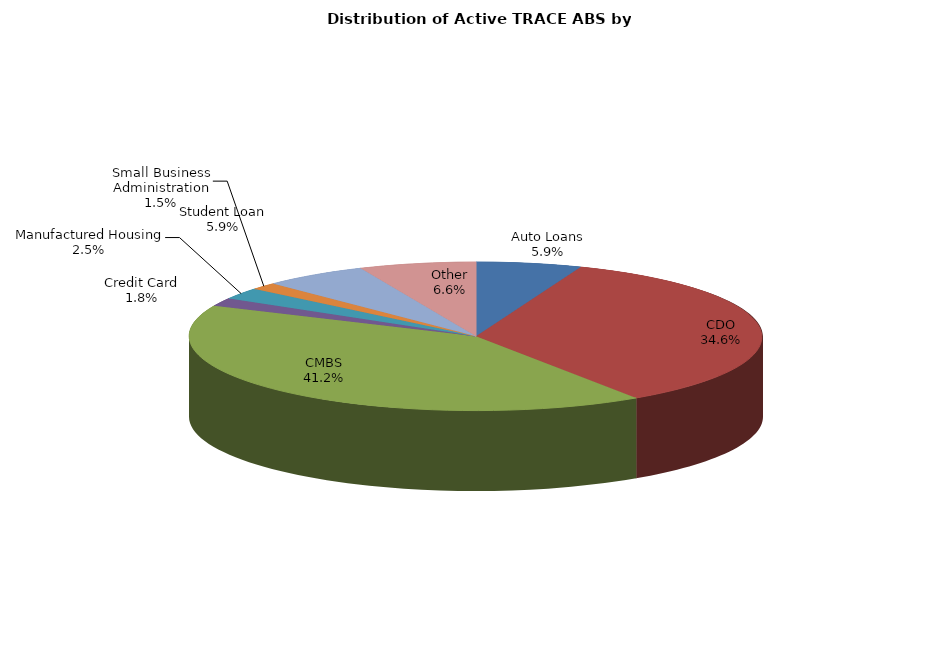
| Category | Series 0 |
|---|---|
| Auto Loans | 1263 |
| CDO | 7356 |
| CMBS | 8743 |
| Credit Card | 376 |
| Manufactured Housing | 526 |
| Small Business Administration | 329 |
| Student Loan | 1249 |
| Other | 1399 |